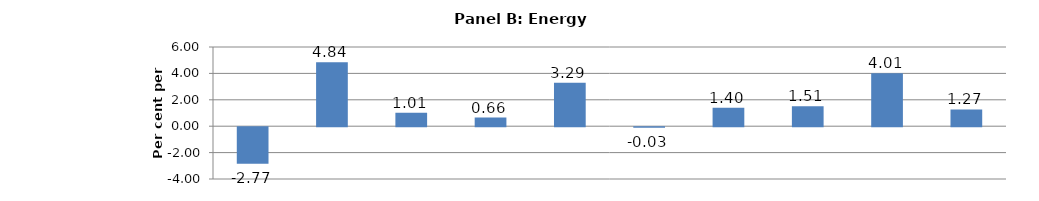
| Category | Series 0 |
|---|---|
| Paper manufacturing | -2.771 |
| Crop and animal production | 4.841 |
| Wood product manufacturing | 1.013 |
| Forestry and logging | 0.658 |
| Fishing, hunting and trapping | 3.295 |
| Petroleum and coal products manufacturing | -0.032 |
| Support activities for mining and oil and gas | 1.405 |
| Oil and gas extraction | 1.514 |
| Mining (except oil and gas) | 4.006 |
| Support activities for agriculture and forestry | 1.268 |